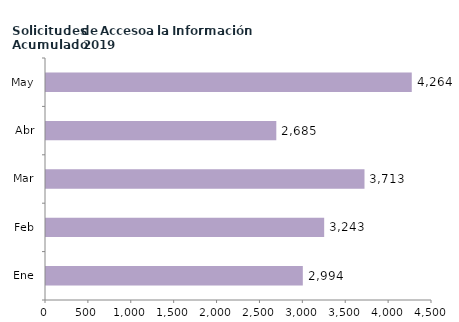
| Category | Series 0 |
|---|---|
| Ene | 2994 |
| Feb | 3243 |
| Mar | 3713 |
| Abr | 2685 |
| May | 4264 |